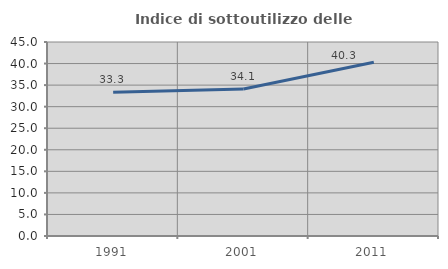
| Category | Indice di sottoutilizzo delle abitazioni  |
|---|---|
| 1991.0 | 33.333 |
| 2001.0 | 34.095 |
| 2011.0 | 40.313 |